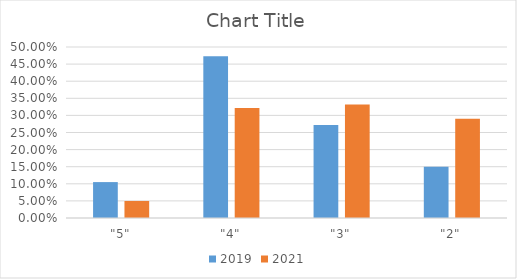
| Category | 2019 | 2021 |
|---|---|---|
| "5" | 0.105 | 0.05 |
| "4" | 0.473 | 0.322 |
| "3" | 0.272 | 0.332 |
| "2" | 0.15 | 0.29 |